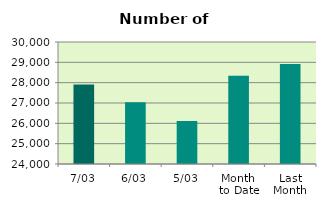
| Category | Series 0 |
|---|---|
| 7/03 | 27914 |
| 6/03 | 27038 |
| 5/03 | 26118 |
| Month 
to Date | 28344 |
| Last
Month | 28915.6 |